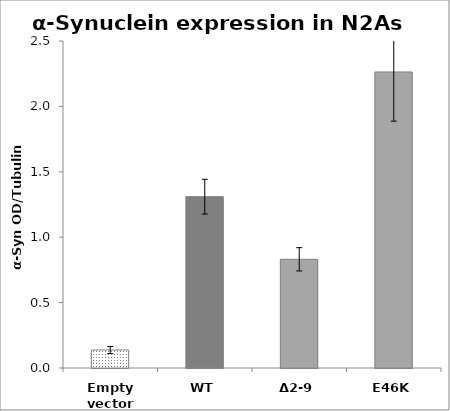
| Category | Series 0 |
|---|---|
| Empty vector | 0.138 |
| WT | 1.31 |
| Δ2-9 | 0.831 |
| E46K | 2.263 |